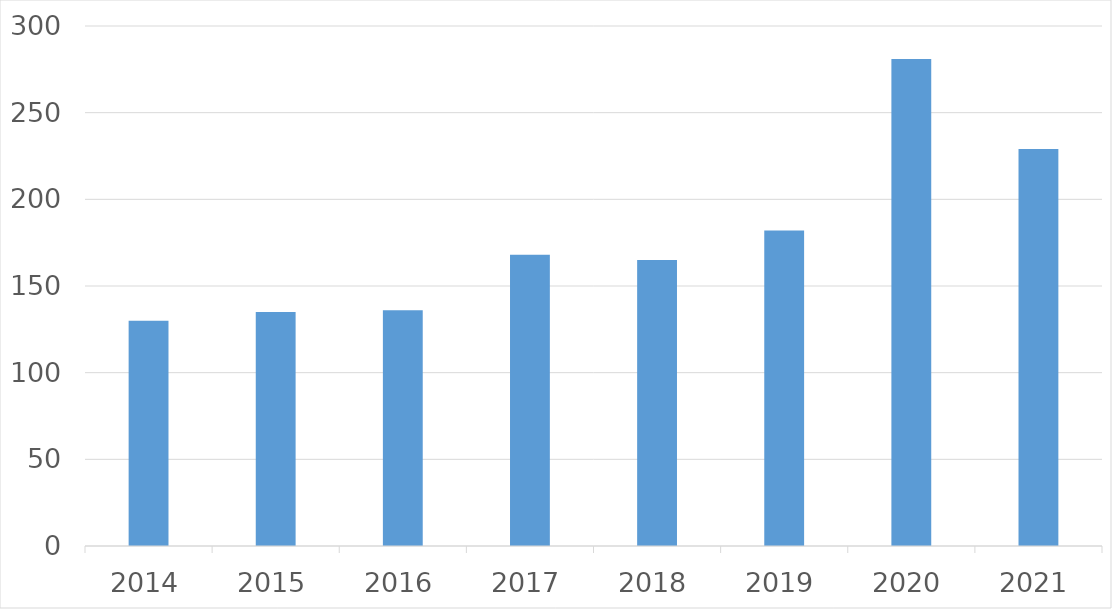
| Category | Series 0 |
|---|---|
| 2014 | 130 |
| 2015 | 135 |
| 2016 | 136 |
| 2017 | 168 |
| 2018 | 165 |
| 2019 | 182 |
| 2020 | 281 |
| 2021 | 229 |